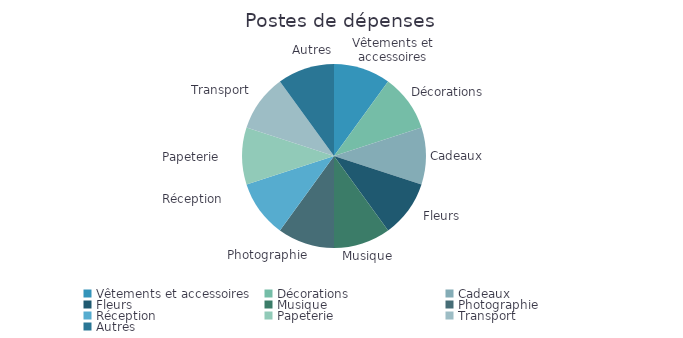
| Category | Montant |
|---|---|
| Vêtements et accessoires | 1 |
| Décorations | 1 |
| Cadeaux | 1 |
| Fleurs | 1 |
| Musique | 1 |
| Photographie | 1 |
| Réception | 1 |
| Papeterie | 1 |
| Transport | 1 |
| Autres | 1 |